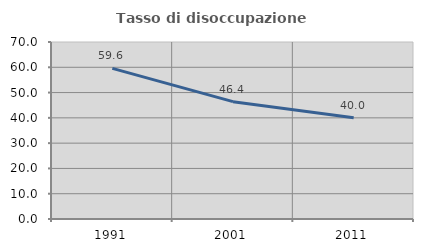
| Category | Tasso di disoccupazione giovanile  |
|---|---|
| 1991.0 | 59.574 |
| 2001.0 | 46.405 |
| 2011.0 | 40 |